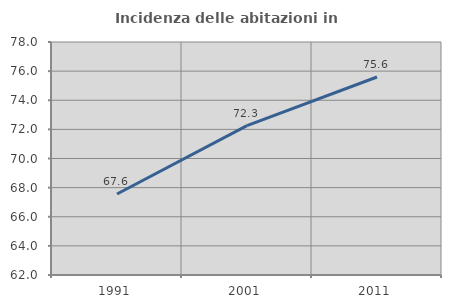
| Category | Incidenza delle abitazioni in proprietà  |
|---|---|
| 1991.0 | 67.56 |
| 2001.0 | 72.262 |
| 2011.0 | 75.598 |